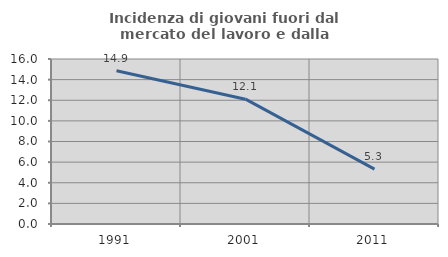
| Category | Incidenza di giovani fuori dal mercato del lavoro e dalla formazione  |
|---|---|
| 1991.0 | 14.861 |
| 2001.0 | 12.104 |
| 2011.0 | 5.328 |